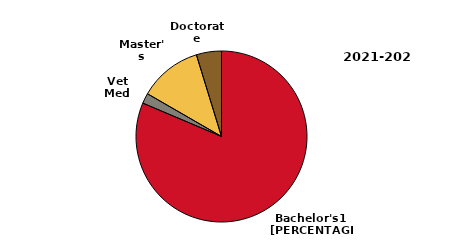
| Category | 2021-2022 |
|---|---|
| Bachelor's1 | 6365 |
| Vet Med | 152 |
| Master's | 933 |
| Doctorate | 371 |